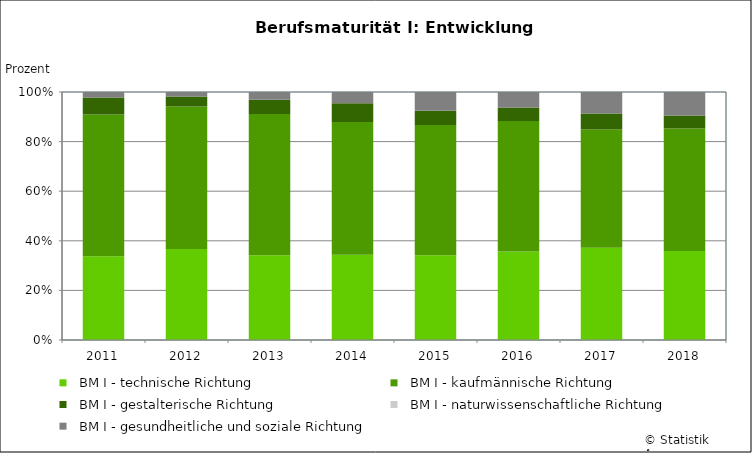
| Category |   BM I - technische Richtung |   BM I - kaufmännische Richtung                |   BM I - gestalterische Richtung               |   BM I - naturwissenschaftliche Richtung      |   BM I - gesundheitliche und soziale Richtung  |
|---|---|---|---|---|---|
| 2011 | 167 | 283 | 34 | 0 | 11 |
| 2012 | 177 | 278 | 19 | 0 | 9 |
| 2013 | 155 | 258 | 26 | 0 | 14 |
| 2014 | 173 | 269 | 38 | 0 | 23 |
| 2015 | 172 | 264 | 29 | 0 | 38 |
| 2016 | 177 | 261 | 27 | 0 | 31 |
| 2017 | 184 | 236 | 32 | 0 | 43 |
| 2018 | 186 | 256 | 27 | 0 | 49 |